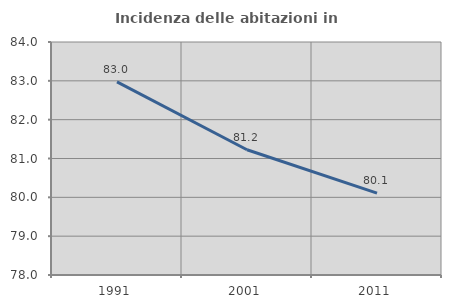
| Category | Incidenza delle abitazioni in proprietà  |
|---|---|
| 1991.0 | 82.971 |
| 2001.0 | 81.225 |
| 2011.0 | 80.107 |